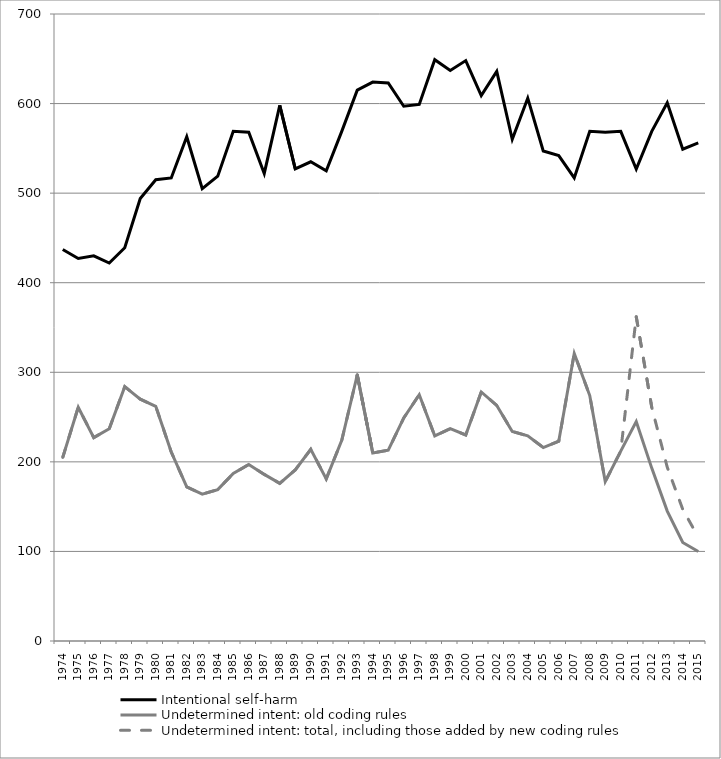
| Category | Intentional self-harm | Undetermined intent: old coding rules | Undetermined intent: total, including those added by new coding rules |
|---|---|---|---|
| 1974.0 | 437 | 205 | 205 |
| 1975.0 | 427 | 261 | 261 |
| 1976.0 | 430 | 227 | 227 |
| 1977.0 | 422 | 237 | 237 |
| 1978.0 | 439 | 284 | 284 |
| 1979.0 | 494 | 270 | 270 |
| 1980.0 | 515 | 262 | 262 |
| 1981.0 | 517 | 211 | 211 |
| 1982.0 | 563 | 172 | 172 |
| 1983.0 | 505 | 164 | 164 |
| 1984.0 | 519 | 169 | 169 |
| 1985.0 | 569 | 187 | 187 |
| 1986.0 | 568 | 197 | 197 |
| 1987.0 | 522 | 186 | 186 |
| 1988.0 | 598 | 176 | 176 |
| 1989.0 | 527 | 191 | 191 |
| 1990.0 | 535 | 214 | 214 |
| 1991.0 | 525 | 181 | 181 |
| 1992.0 | 569 | 224 | 224 |
| 1993.0 | 615 | 297 | 297 |
| 1994.0 | 624 | 210 | 210 |
| 1995.0 | 623 | 213 | 213 |
| 1996.0 | 597 | 249 | 249 |
| 1997.0 | 599 | 275 | 275 |
| 1998.0 | 649 | 229 | 229 |
| 1999.0 | 637 | 237 | 237 |
| 2000.0 | 648 | 230 | 230 |
| 2001.0 | 609 | 278 | 278 |
| 2002.0 | 636 | 263 | 263 |
| 2003.0 | 560 | 234 | 234 |
| 2004.0 | 606 | 229 | 229 |
| 2005.0 | 547 | 216 | 216 |
| 2006.0 | 542 | 223 | 223 |
| 2007.0 | 517 | 321 | 321 |
| 2008.0 | 569 | 274 | 274 |
| 2009.0 | 568 | 178 | 178 |
| 2010.0 | 569 | 212 | 212 |
| 2011.0 | 527 | 245 | 362 |
| 2012.0 | 569 | 193 | 261 |
| 2013.0 | 601 | 145 | 194 |
| 2014.0 | 549 | 110 | 147 |
| 2015.0 | 556 | 100 | 116 |